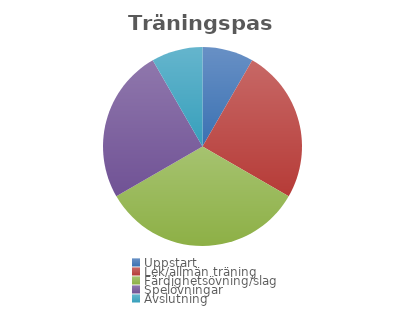
| Category | Series 0 |
|---|---|
| Uppstart | 5 |
| Lek/allmän träning | 15 |
| Färdighetsövning/slag | 20 |
| Spelövningar | 15 |
| Avslutning | 5 |